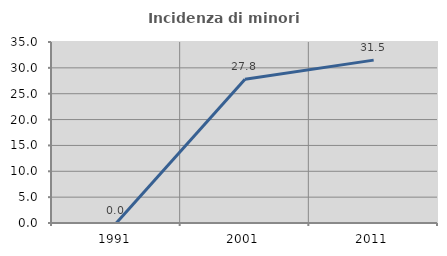
| Category | Incidenza di minori stranieri |
|---|---|
| 1991.0 | 0 |
| 2001.0 | 27.778 |
| 2011.0 | 31.496 |